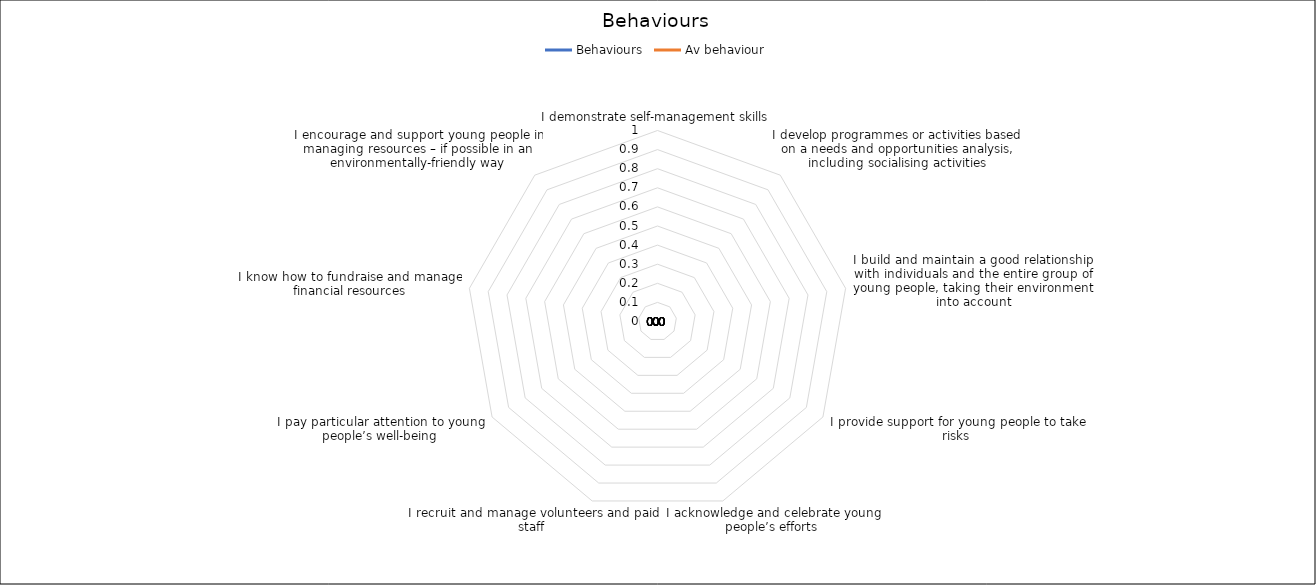
| Category | Behaviours | Av behaviour |
|---|---|---|
| I demonstrate self-management skills | 0 | 0 |
| I develop programmes or activities based on a needs and opportunities analysis, including socialising activities | 0 | 0 |
| I build and maintain a good relationship with individuals and the entire group of young people, taking their environment into account | 0 | 0 |
| I provide support for young people to take risks  | 0 | 0 |
| I acknowledge and celebrate young people’s efforts  | 0 | 0 |
| I recruit and manage volunteers and paid staff  | 0 | 0 |
| I pay particular attention to young people’s well-being | 0 | 0 |
| I know how to fundraise and manage financial resources | 0 | 0 |
| I encourage and support young people in managing resources – if possible in an environmentally-friendly way | 0 | 0 |